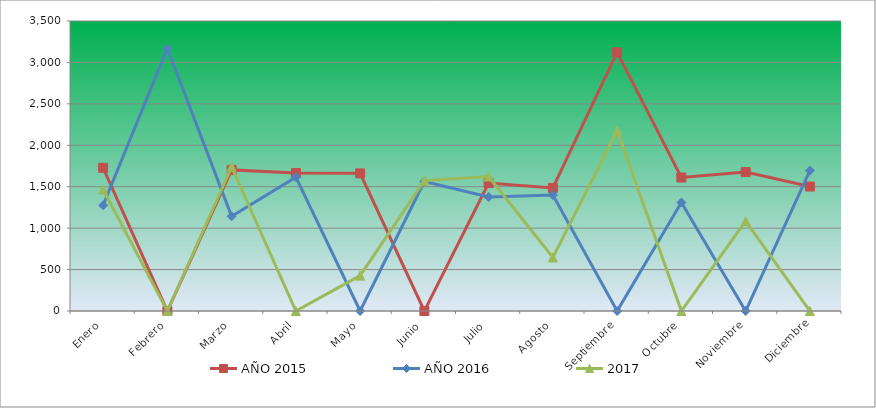
| Category | AÑO 2015 | AÑO 2016 | 2017 |
|---|---|---|---|
| Enero | 1728.072 | 1276.015 | 1466.012 |
| Febrero | 0 | 3169.322 | 0 |
| Marzo | 1702.967 | 1143.442 | 1739.336 |
| Abril | 1665.309 | 1615.733 | 0 |
| Mayo | 1661.125 | 0 | 426.552 |
| Junio | 0 | 1561.875 | 1573.685 |
| Julio | 1543.967 | 1375.444 | 1623.381 |
| Agosto | 1485.389 | 1400.302 | 646.039 |
| Septiembre | 3121.408 | 0 | 2178.312 |
| Octubre | 1610.914 | 1309.158 | 0 |
| Noviembre | 1677.861 | 0 | 1085.015 |
| Diciembre | 1502.125 | 1694.448 | 0 |